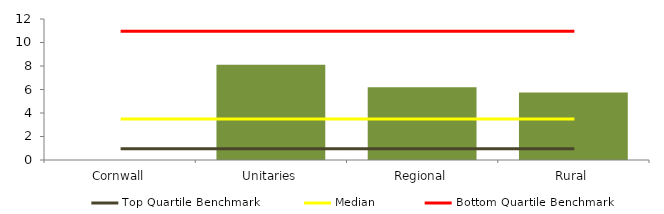
| Category | Block Data |
|---|---|
| Cornwall | 0 |
| Unitaries | 8.109 |
| Regional | 6.191 |
|  Rural  | 5.737 |